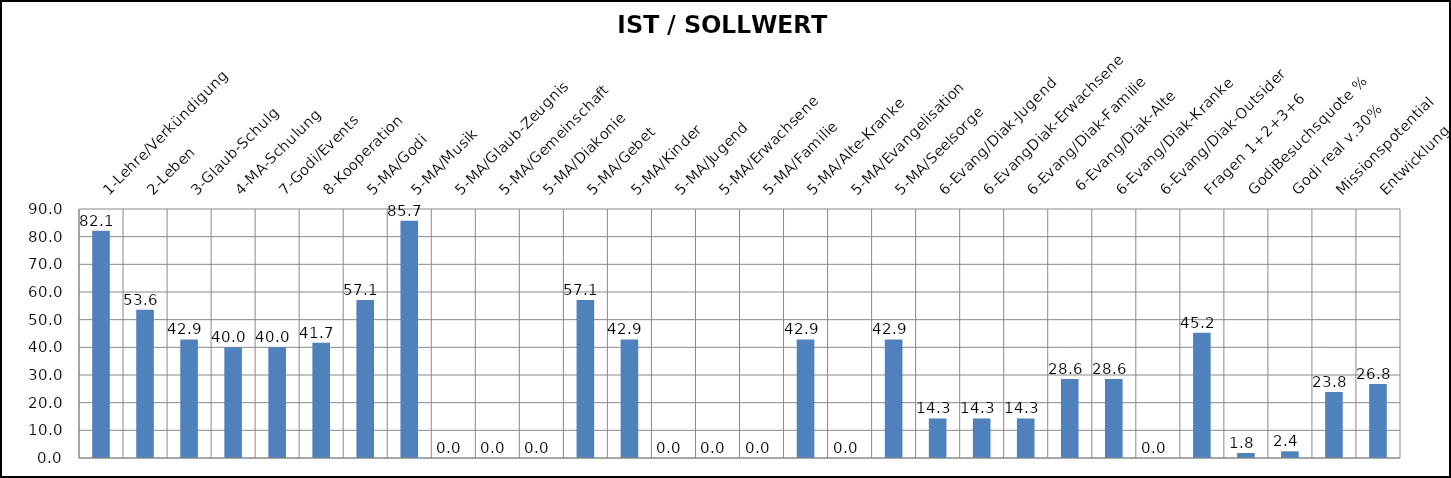
| Category | IST / SOLLWERT % |
|---|---|
| 1-Lehre/Verkündigung  | 82.143 |
| 2-Leben | 53.571 |
| 3-Glaub-Schulg | 42.857 |
| 4-MA-Schulung | 40 |
| 7-Godi/Events | 40 |
| 8-Kooperation | 41.667 |
| 5-MA/Godi | 57.143 |
| 5-MA/Musik | 85.714 |
| 5-MA/Glaub-Zeugnis | 0 |
| 5-MA/Gemeinschaft | 0 |
| 5-MA/Diakonie | 0 |
| 5-MA/Gebet | 57.143 |
| 5-MA/Kinder | 42.857 |
| 5-MA/Jugend | 0 |
| 5-MA/Erwachsene | 0 |
| 5-MA/Familie | 0 |
| 5-MA/Alte-Kranke | 42.857 |
| 5-MA/Evangelisation | 0 |
| 5-MA/Seelsorge | 42.857 |
| 6-Evang/Diak-Jugend | 14.286 |
| 6-EvangDiak-Erwachsene | 14.286 |
| 6-Evang/Diak-Familie | 14.286 |
|  6-Evang/Diak-Alte | 28.571 |
| 6-Evang/Diak-Kranke | 28.571 |
| 6-Evang/Diak-Outsider | 0 |
| Fragen 1+2+3+6 | 45.238 |
| GodiBesuchsquote % | 1.8 |
| Godi real v.30% | 2.4 |
| Missionspotential | 23.819 |
| Entwicklung | 26.78 |